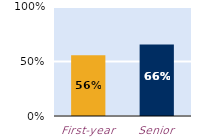
| Category | frequently |
|---|---|
| First-year | 0.557 |
| Senior | 0.656 |